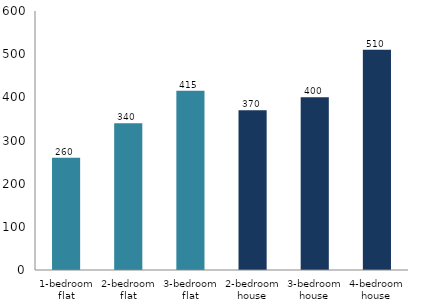
| Category | Series 0 |
|---|---|
| 1-bedroom flat | 260 |
| 2-bedroom flat | 340 |
| 3-bedroom flat | 415 |
| 2-bedroom house | 370 |
| 3-bedroom house | 400 |
| 4-bedroom house | 510 |